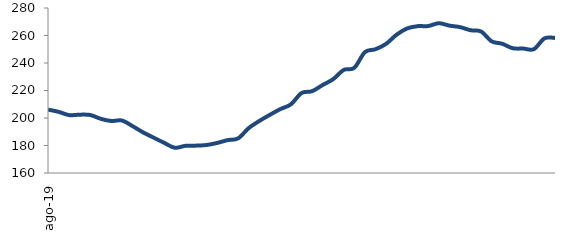
| Category | Series 0 |
|---|---|
| 2019-08-01 | 206.107 |
| 2019-09-01 | 204.488 |
| 2019-10-01 | 202.111 |
| 2019-11-01 | 202.424 |
| 2019-12-01 | 202.177 |
| 2020-01-01 | 199.409 |
| 2020-02-01 | 197.826 |
| 2020-03-01 | 198.161 |
| 2020-04-01 | 194.123 |
| 2020-05-01 | 189.538 |
| 2020-06-01 | 185.731 |
| 2020-07-01 | 181.914 |
| 2020-08-01 | 178.343 |
| 2020-09-01 | 179.758 |
| 2020-10-01 | 179.9 |
| 2020-11-01 | 180.346 |
| 2020-12-01 | 181.827 |
| 2021-01-01 | 183.909 |
| 2021-02-01 | 185.191 |
| 2021-03-01 | 192.66 |
| 2021-04-01 | 197.814 |
| 2021-05-01 | 202.28 |
| 2021-06-01 | 206.474 |
| 2021-07-01 | 209.951 |
| 2021-08-01 | 218.146 |
| 2021-09-01 | 219.495 |
| 2021-10-01 | 224.001 |
| 2021-11-01 | 228.234 |
| 2021-12-01 | 234.966 |
| 2022-01-01 | 236.495 |
| 2022-02-01 | 247.883 |
| 2022-03-01 | 250.016 |
| 2022-04-01 | 253.872 |
| 2022-05-01 | 260.574 |
| 2022-06-01 | 265.125 |
| 2022-07-01 | 266.79 |
| 2022-08-01 | 266.867 |
| 2022-09-01 | 268.948 |
| 2022-10-01 | 267.186 |
| 2022-11-01 | 266.12 |
| 2022-12-01 | 263.849 |
| 2023-01-01 | 262.911 |
| 2023-02-01 | 255.756 |
| 2023-03-01 | 253.995 |
| 2023-04-01 | 250.72 |
| 2023-05-01 | 250.501 |
| 2023-06-01 | 250.068 |
| 2023-07-01 | 257.894 |
| 2023-08-01 | 258.252 |